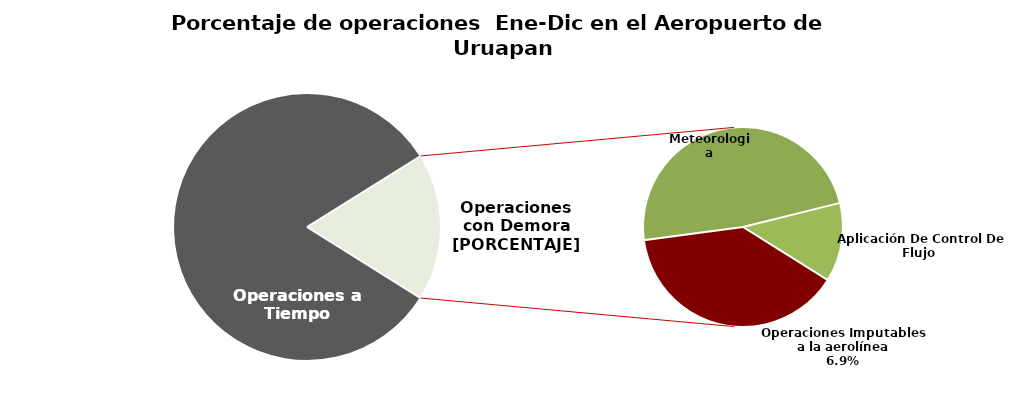
| Category | Series 0 |
|---|---|
| Operaciones a Tiempo | 652 |
| Operaciones Imputables a la aerolínea | 55 |
| Meteorologia | 68 |
| Aplicación De Control De Flujo  | 18 |